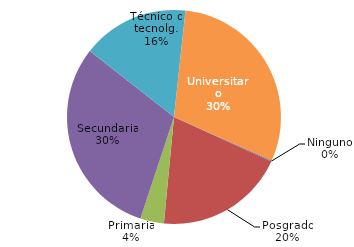
| Category | -46,2 |
|---|---|
| Ninguno | 4.644 |
| Posgrado | 540.424 |
| Primaria | 98.118 |
| Secundaria | 837.523 |
| Técnico o tecnolg. | 443.39 |
| Universitario | 822.553 |